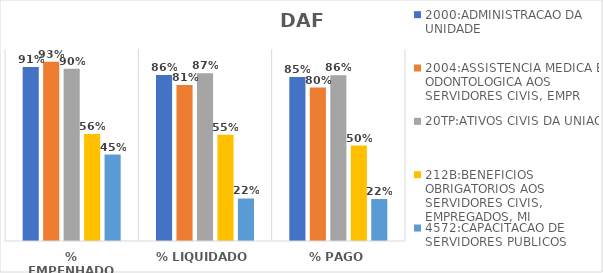
| Category | 2000:ADMINISTRACAO DA UNIDADE | 2004:ASSISTENCIA MEDICA E ODONTOLOGICA AOS SERVIDORES CIVIS, EMPR | 20TP:ATIVOS CIVIS DA UNIAO | 212B:BENEFICIOS OBRIGATORIOS AOS SERVIDORES CIVIS, EMPREGADOS, MI | 4572:CAPACITACAO DE SERVIDORES PUBLICOS FEDERAIS EM PROCESSO DE Q |
|---|---|---|---|---|---|
| % EMPENHADO | 0.906 | 0.934 | 0.898 | 0.557 | 0.45 |
| % LIQUIDADO | 0.864 | 0.813 | 0.873 | 0.553 | 0.221 |
| % PAGO | 0.854 | 0.799 | 0.864 | 0.497 | 0.219 |